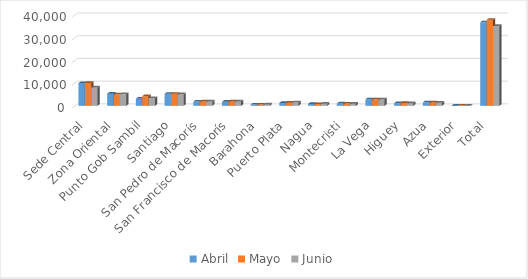
| Category | Abril | Mayo | Junio |
|---|---|---|---|
| Sede Central | 9987 | 10097 | 8109 |
| Zona Oriental | 5356 | 5041 | 5152 |
| Punto Gob Sambil | 3111 | 4235 | 3433 |
| Santiago | 5294 | 5303 | 5092 |
| San Pedro de Macorís | 1858 | 1906 | 1938 |
| San Francisco de Macorís | 1788 | 1909 | 1933 |
| Barahona | 558 | 547 | 616 |
| Puerto Plata | 1289 | 1365 | 1562 |
| Nagua | 804 | 773 | 938 |
| Montecristi | 1015 | 973 | 952 |
| La Vega | 2857 | 2867 | 2783 |
| Higuey | 1210 | 1264 | 1177 |
| Azua | 1552 | 1466 | 1379 |
| Exterior | 79 | 127 | 62 |
| Total | 36758 | 37873 | 35126 |